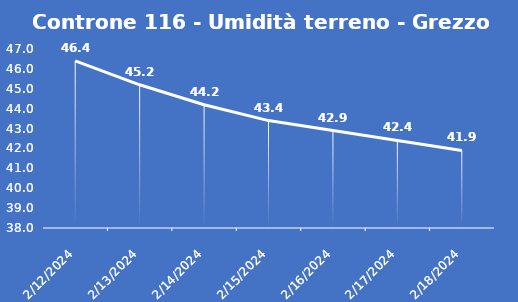
| Category | Controne 116 - Umidità terreno - Grezzo (%VWC) |
|---|---|
| 2/12/24 | 46.4 |
| 2/13/24 | 45.2 |
| 2/14/24 | 44.2 |
| 2/15/24 | 43.4 |
| 2/16/24 | 42.9 |
| 2/17/24 | 42.4 |
| 2/18/24 | 41.9 |